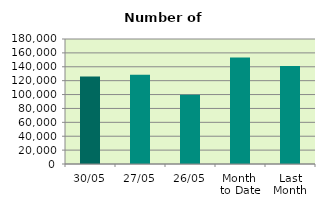
| Category | Series 0 |
|---|---|
| 30/05 | 125906 |
| 27/05 | 128362 |
| 26/05 | 99620 |
| Month 
to Date | 153268.762 |
| Last
Month | 140978.316 |